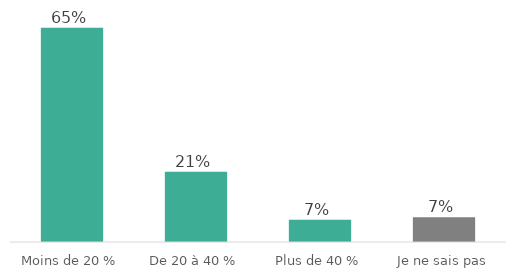
| Category | Series 0 |
|---|---|
| Moins de 20 % | 64.625 |
| De 20 à 40 % | 21.162 |
| Plus de 40 % | 6.735 |
| Je ne sais pas | 7.478 |